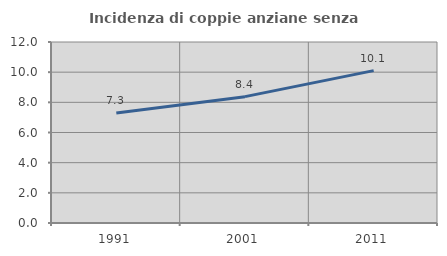
| Category | Incidenza di coppie anziane senza figli  |
|---|---|
| 1991.0 | 7.291 |
| 2001.0 | 8.377 |
| 2011.0 | 10.102 |